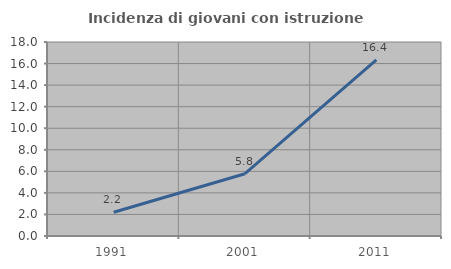
| Category | Incidenza di giovani con istruzione universitaria |
|---|---|
| 1991.0 | 2.204 |
| 2001.0 | 5.778 |
| 2011.0 | 16.351 |